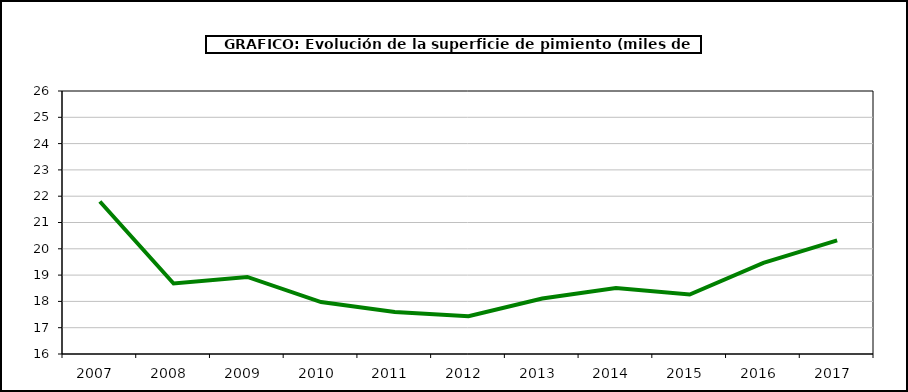
| Category | superficie |
|---|---|
| 2007.0 | 21.798 |
| 2008.0 | 18.681 |
| 2009.0 | 18.931 |
| 2010.0 | 17.975 |
| 2011.0 | 17.595 |
| 2012.0 | 17.44 |
| 2013.0 | 18.108 |
| 2014.0 | 18.513 |
| 2015.0 | 18.263 |
| 2016.0 | 19.468 |
| 2017.0 | 20.319 |